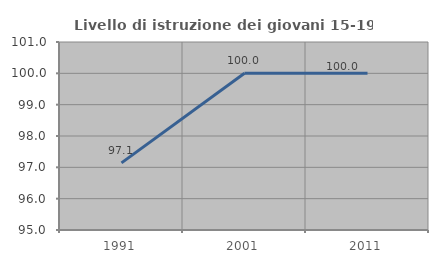
| Category | Livello di istruzione dei giovani 15-19 anni |
|---|---|
| 1991.0 | 97.143 |
| 2001.0 | 100 |
| 2011.0 | 100 |